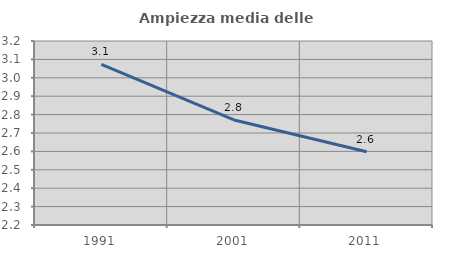
| Category | Ampiezza media delle famiglie |
|---|---|
| 1991.0 | 3.073 |
| 2001.0 | 2.771 |
| 2011.0 | 2.598 |